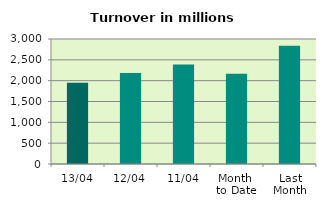
| Category | Series 0 |
|---|---|
| 13/04 | 1949.101 |
| 12/04 | 2185.478 |
| 11/04 | 2389.526 |
| Month 
to Date | 2165.391 |
| Last
Month | 2840.905 |